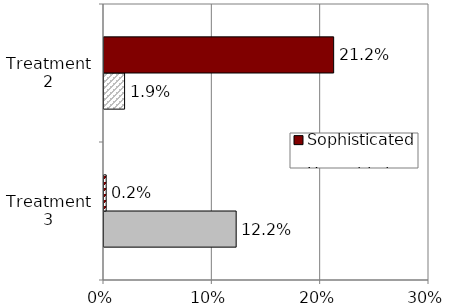
| Category | Unsophisticated | Sophisticated |
|---|---|---|
| Treatment 3 | 0.122 | 0.002 |
| Treatment 2 | 0.019 | 0.212 |